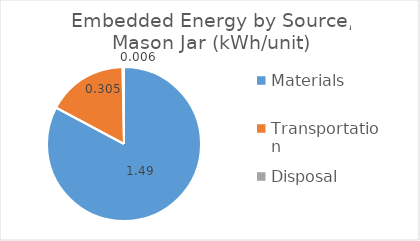
| Category | Series 0 |
|---|---|
| Materials | 1.495 |
| Transportation | 0.305 |
| Disposal | 0.006 |